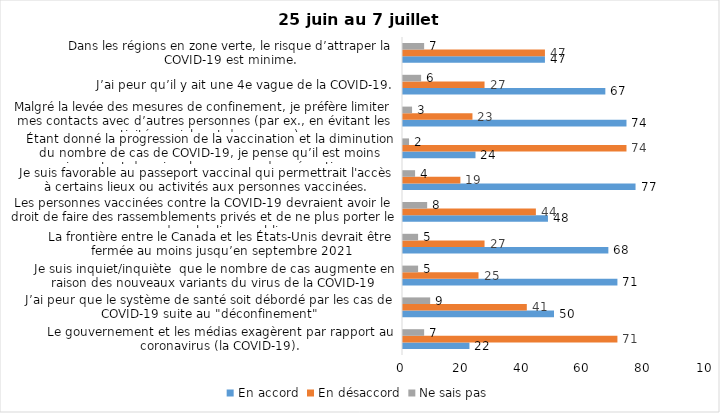
| Category | En accord | En désaccord | Ne sais pas |
|---|---|---|---|
| Le gouvernement et les médias exagèrent par rapport au coronavirus (la COVID-19). | 22 | 71 | 7 |
| J’ai peur que le système de santé soit débordé par les cas de COVID-19 suite au "déconfinement" | 50 | 41 | 9 |
| Je suis inquiet/inquiète  que le nombre de cas augmente en raison des nouveaux variants du virus de la COVID-19 | 71 | 25 | 5 |
| La frontière entre le Canada et les États-Unis devrait être fermée au moins jusqu’en septembre 2021 | 68 | 27 | 5 |
| Les personnes vaccinées contre la COVID-19 devraient avoir le droit de faire des rassemblements privés et de ne plus porter le masque dans les lieux publics. | 48 | 44 | 8 |
| Je suis favorable au passeport vaccinal qui permettrait l'accès à certains lieux ou activités aux personnes vaccinées. | 77 | 19 | 4 |
| Étant donné la progression de la vaccination et la diminution du nombre de cas de COVID-19, je pense qu’il est moins important de suivre les mesures de prévention. | 24 | 74 | 2 |
| Malgré la levée des mesures de confinement, je préfère limiter mes contacts avec d’autres personnes (par ex., en évitant les activités sociales et de groupes) | 74 | 23 | 3 |
| J’ai peur qu’il y ait une 4e vague de la COVID-19. | 67 | 27 | 6 |
| Dans les régions en zone verte, le risque d’attraper la COVID-19 est minime. | 47 | 47 | 7 |